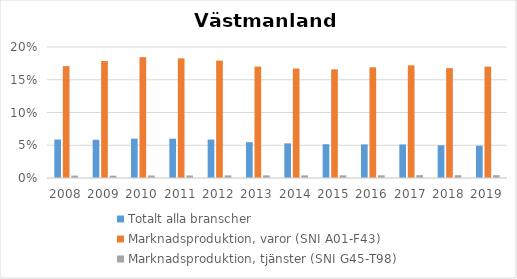
| Category | Totalt alla branscher | Marknadsproduktion, varor (SNI A01-F43) | Marknadsproduktion, tjänster (SNI G45-T98) |
|---|---|---|---|
| 2008.0 | 0.059 | 0.171 | 0.004 |
| 2009.0 | 0.058 | 0.179 | 0.004 |
| 2010.0 | 0.06 | 0.184 | 0.004 |
| 2011.0 | 0.06 | 0.183 | 0.004 |
| 2012.0 | 0.059 | 0.179 | 0.004 |
| 2013.0 | 0.055 | 0.17 | 0.004 |
| 2014.0 | 0.053 | 0.167 | 0.004 |
| 2015.0 | 0.052 | 0.166 | 0.004 |
| 2016.0 | 0.051 | 0.169 | 0.004 |
| 2017.0 | 0.051 | 0.172 | 0.004 |
| 2018.0 | 0.05 | 0.168 | 0.004 |
| 2019.0 | 0.049 | 0.17 | 0.004 |